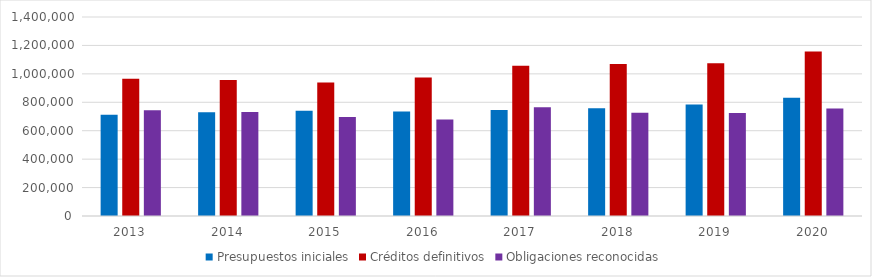
| Category | Presupuestos iniciales | Créditos definitivos | Obligaciones reconocidas |
|---|---|---|---|
| 2013.0 | 713002.158 | 965003.591 | 744398.393 |
| 2014.0 | 729663.12 | 956965.337 | 731935.083 |
| 2015.0 | 740573.085 | 939366.111 | 695990.213 |
| 2016.0 | 735782 | 974473.812 | 679086.921 |
| 2017.0 | 745416 | 1056554.578 | 764579.315 |
| 2018.0 | 757960 | 1070125.118 | 726125.339 |
| 2019.0 | 783849.823 | 1074954.164 | 724187.398 |
| 2020.0 | 831798 | 1156412.011 | 756047.283 |